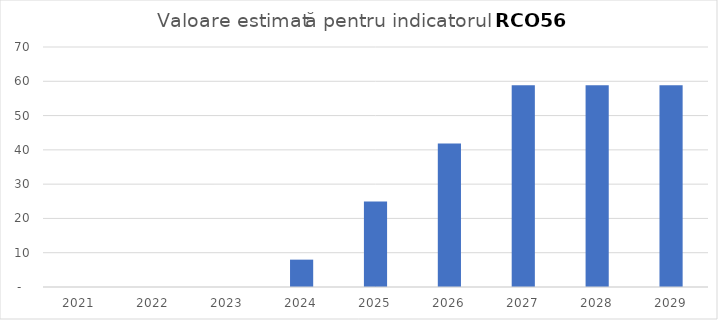
| Category | Series 0 |
|---|---|
| 2021.0 | 0 |
| 2022.0 | 0 |
| 2023.0 | 0 |
| 2024.0 | 7.979 |
| 2025.0 | 24.933 |
| 2026.0 | 41.888 |
| 2027.0 | 58.842 |
| 2028.0 | 58.842 |
| 2029.0 | 58.842 |